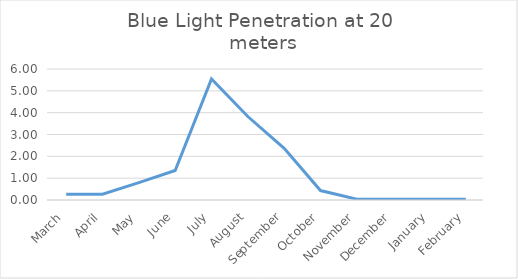
| Category | 0.16 |
|---|---|
| March | 0.262 |
| April | 0.266 |
| May | 0.795 |
| June | 1.35 |
| July | 5.546 |
| August | 3.824 |
| September | 2.365 |
| October | 0.433 |
| November | 0.037 |
| December | 0.036 |
| January | 0.037 |
| February | 0.038 |